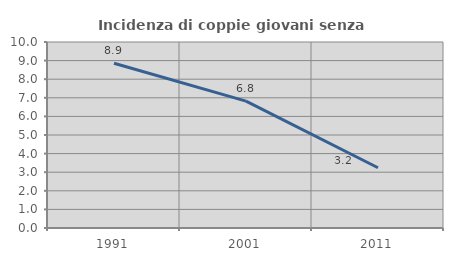
| Category | Incidenza di coppie giovani senza figli |
|---|---|
| 1991.0 | 8.857 |
| 2001.0 | 6.822 |
| 2011.0 | 3.239 |